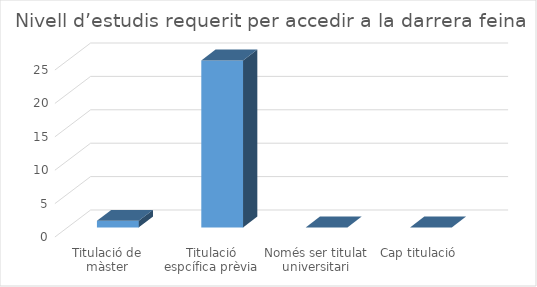
| Category | Series 0 |
|---|---|
| Titulació de màster | 1 |
| Titulació espcífica prèvia | 25 |
| Només ser titulat universitari | 0 |
| Cap titulació | 0 |